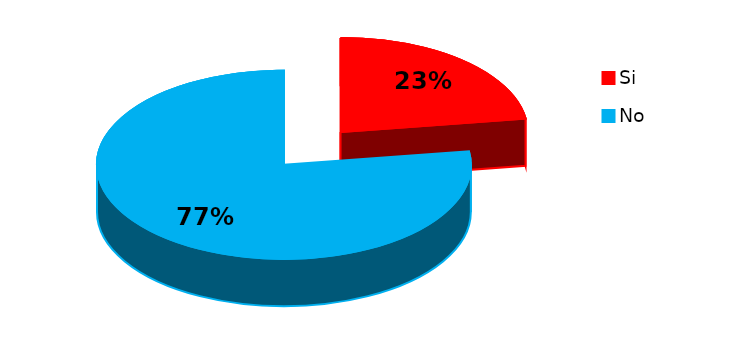
| Category | Series 0 |
|---|---|
| 0 | 32 |
| 1 | 109 |